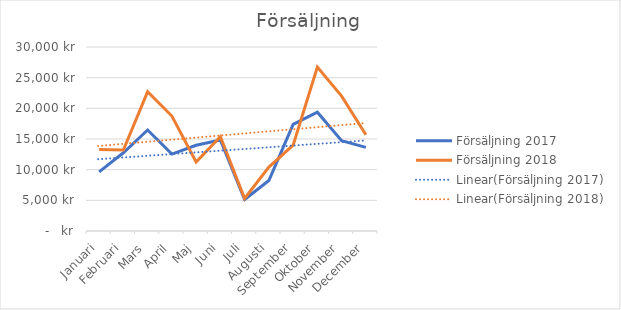
| Category | Försäljning 2017 | Försäljning 2018 |
|---|---|---|
| Januari | 9635 | 13296.3 |
| Februari | 12753 | 13199.355 |
| Mars | 16470 | 22728.6 |
| April | 12535 | 18739.825 |
| Maj | 13983 | 11256.315 |
| Juni | 14847 | 15366.645 |
| Juli | 5128 | 5307.48 |
| Augusti | 8236 | 10418.54 |
| September | 17387 | 13996.535 |
| Oktober | 19371 | 26731.98 |
| November | 14711 | 21992.945 |
| December | 13636 | 15681.4 |